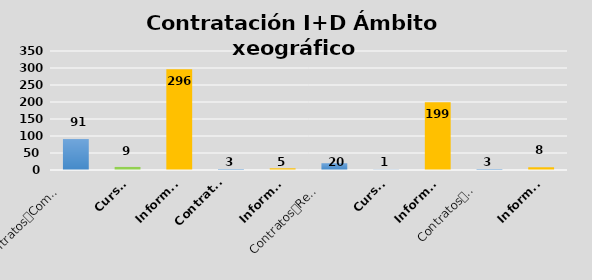
| Category | Series 0 |
|---|---|
| 0 | 91 |
| 1 | 9 |
| 2 | 296 |
| 3 | 3 |
| 4 | 5 |
| 5 | 20 |
| 6 | 1 |
| 7 | 199 |
| 8 | 3 |
| 9 | 8 |